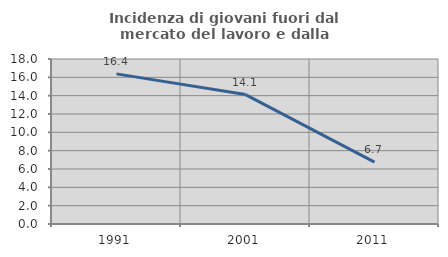
| Category | Incidenza di giovani fuori dal mercato del lavoro e dalla formazione  |
|---|---|
| 1991.0 | 16.379 |
| 2001.0 | 14.118 |
| 2011.0 | 6.742 |